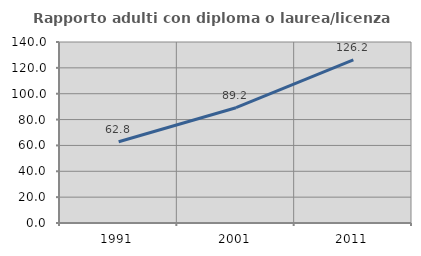
| Category | Rapporto adulti con diploma o laurea/licenza media  |
|---|---|
| 1991.0 | 62.849 |
| 2001.0 | 89.173 |
| 2011.0 | 126.212 |